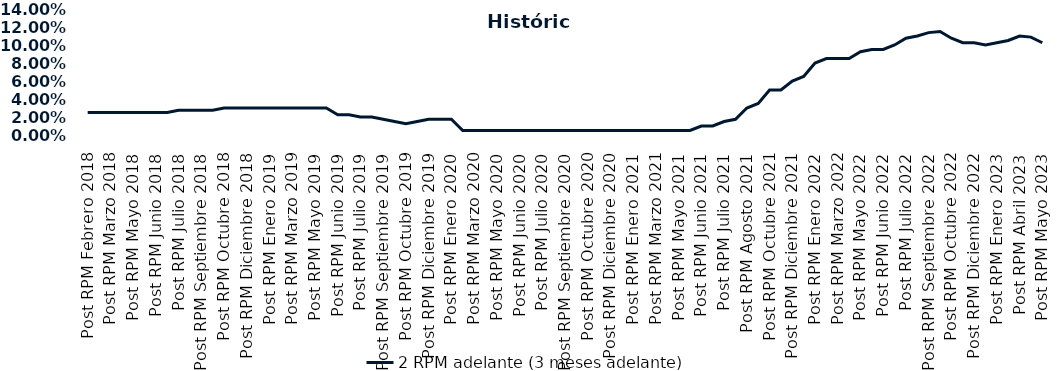
| Category | 2 RPM adelante (3 meses adelante) |
|---|---|
| Post RPM Febrero 2018 | 0.025 |
| Pre RPM Marzo 2018 | 0.025 |
| Post RPM Marzo 2018 | 0.025 |
| Pre RPM Mayo 2018 | 0.025 |
| Post RPM Mayo 2018 | 0.025 |
| Pre RPM Junio 2018 | 0.025 |
| Post RPM Junio 2018 | 0.025 |
| Pre RPM Julio 2018 | 0.025 |
| Post RPM Julio 2018 | 0.028 |
| Pre RPM Septiembre 2018 | 0.028 |
| Post RPM Septiembre 2018 | 0.028 |
| Pre RPM Octubre 2018 | 0.028 |
| Post RPM Octubre 2018 | 0.03 |
| Pre RPM Diciembre 2018 | 0.03 |
| Post RPM Diciembre 2018 | 0.03 |
| Pre RPM Enero 2019 | 0.03 |
| Post RPM Enero 2019 | 0.03 |
| Pre RPM Marzo 2019 | 0.03 |
| Post RPM Marzo 2019 | 0.03 |
| Pre RPM Mayo 2019 | 0.03 |
| Post RPM Mayo 2019 | 0.03 |
| Pre RPM Junio 2019 | 0.03 |
| Post RPM Junio 2019 | 0.022 |
| Pre RPM Julio 2019 | 0.022 |
| Post RPM Julio 2019 | 0.02 |
| Pre RPM Septiembre 2019 | 0.02 |
| Post RPM Septiembre 2019 | 0.018 |
| Pre RPM Octubre 2019 | 0.015 |
| Post RPM Octubre 2019 | 0.012 |
| Pre RPM Diciembre 2019 | 0.015 |
| Post RPM Diciembre 2019 | 0.018 |
| Pre RPM Enero 2020 | 0.018 |
| Post RPM Enero 2020 | 0.018 |
| Pre RPM Marzo 2020 | 0.005 |
| Post RPM Marzo 2020 | 0.005 |
| Pre RPM Mayo 2020 | 0.005 |
| Post RPM Mayo 2020 | 0.005 |
| Pre RPM Junio 2020 | 0.005 |
| Post RPM Junio 2020 | 0.005 |
| Pre RPM Julio 2020 | 0.005 |
| Post RPM Julio 2020 | 0.005 |
| Pre RPM Septiembre 2020 | 0.005 |
| Post RPM Septiembre 2020 | 0.005 |
| Pre RPM Octubre 2020 | 0.005 |
| Post RPM Octubre 2020 | 0.005 |
| Pre RPM Diciembre 2020 | 0.005 |
| Post RPM Diciembre 2020 | 0.005 |
| Pre RPM Enero 2021 | 0.005 |
| Post RPM Enero 2021 | 0.005 |
| Pre RPM Marzo 2021 | 0.005 |
| Post RPM Marzo 2021 | 0.005 |
| Pre RPM Mayo 2021 | 0.005 |
| Post RPM Mayo 2021 | 0.005 |
| Pre RPM Junio 2021 | 0.005 |
| Post RPM Junio 2021 | 0.01 |
| Pre RPM Julio 2021 | 0.01 |
| Post RPM Julio 2021 | 0.015 |
| Pre RPM Agosto 2021 | 0.018 |
| Post RPM Agosto 2021 | 0.03 |
| Pre RPM Octubre 2021 | 0.035 |
| Post RPM Octubre 2021 | 0.05 |
| Pre RPM Diciembre 2021 | 0.05 |
| Post RPM Diciembre 2021 | 0.06 |
| Pre RPM Enero 2022 | 0.065 |
| Post RPM Enero 2022 | 0.08 |
| Pre RPM Marzo 2022 | 0.085 |
| Post RPM Marzo 2022 | 0.085 |
| Pre RPM Mayo 2022 | 0.085 |
| Post RPM Mayo 2022 | 0.092 |
| Pre RPM Junio 2022 | 0.095 |
| Post RPM Junio 2022 | 0.095 |
| Pre RPM Julio 2022 | 0.1 |
| Post RPM Julio 2022 | 0.108 |
| Pre RPM Septiembre 2022 | 0.11 |
| Post RPM Septiembre 2022 | 0.114 |
| Pre RPM Octubre 2022 | 0.115 |
| Post RPM Octubre 2022 | 0.108 |
| Pre RPM Diciembre 2022 | 0.102 |
| Post RPM Diciembre 2022 | 0.102 |
| Pre RPM Enero 2023 | 0.1 |
| Post RPM Enero 2023 | 0.102 |
| Pre RPM Abril 2023 | 0.105 |
| Post RPM Abril 2023 | 0.11 |
| Pre RPM Mayo 2023 | 0.109 |
| Post RPM Mayo 2023 | 0.102 |